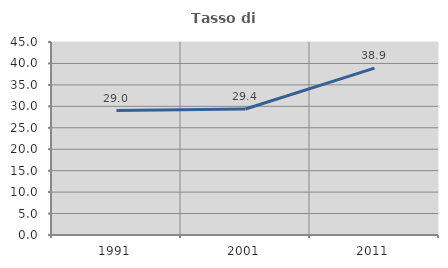
| Category | Tasso di occupazione   |
|---|---|
| 1991.0 | 29.021 |
| 2001.0 | 29.386 |
| 2011.0 | 38.905 |